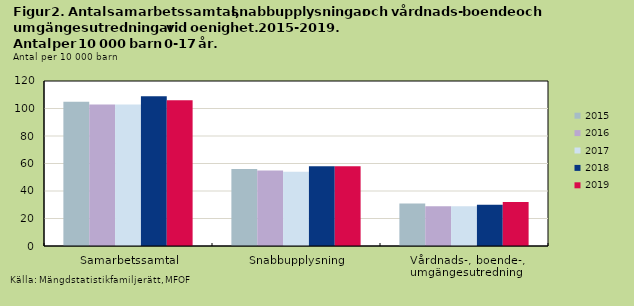
| Category | 2015 | 2016 | 2017 | 2018 | 2019 |
|---|---|---|---|---|---|
| Samarbetssamtal | 105 | 103 | 103 | 109 | 106 |
| Snabbupplysning | 56 | 55 | 54 | 58 | 58 |
| Vårdnads-, boende-, umgängesutredning | 31 | 29 | 29 | 30 | 32 |